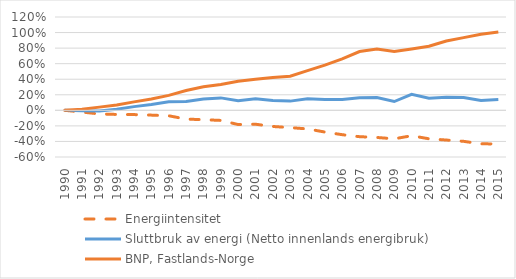
| Category | Energiintensitet | Sluttbruk av energi (Netto innenlands energibruk) | BNP, Fastlands-Norge |
|---|---|---|---|
| 1990.0 | 0 | 0 | 0 |
| 1991.0 | -0.022 | -0.007 | 0.015 |
| 1992.0 | -0.047 | -0.008 | 0.041 |
| 1993.0 | -0.053 | 0.013 | 0.07 |
| 1994.0 | -0.055 | 0.048 | 0.108 |
| 1995.0 | -0.062 | 0.075 | 0.146 |
| 1996.0 | -0.07 | 0.109 | 0.192 |
| 1997.0 | -0.113 | 0.112 | 0.254 |
| 1998.0 | -0.12 | 0.146 | 0.302 |
| 1999.0 | -0.13 | 0.16 | 0.333 |
| 2000.0 | -0.183 | 0.123 | 0.374 |
| 2001.0 | -0.179 | 0.15 | 0.4 |
| 2002.0 | -0.208 | 0.126 | 0.421 |
| 2003.0 | -0.222 | 0.119 | 0.438 |
| 2004.0 | -0.239 | 0.148 | 0.51 |
| 2005.0 | -0.279 | 0.14 | 0.581 |
| 2006.0 | -0.313 | 0.141 | 0.661 |
| 2007.0 | -0.339 | 0.161 | 0.756 |
| 2008.0 | -0.349 | 0.164 | 0.787 |
| 2009.0 | -0.366 | 0.113 | 0.756 |
| 2010.0 | -0.327 | 0.205 | 0.79 |
| 2011.0 | -0.366 | 0.157 | 0.824 |
| 2012.0 | -0.382 | 0.169 | 0.892 |
| 2013.0 | -0.398 | 0.164 | 0.935 |
| 2014.0 | -0.431 | 0.126 | 0.978 |
| 2015.0 | -0.432 | 0.139 | 1.006 |